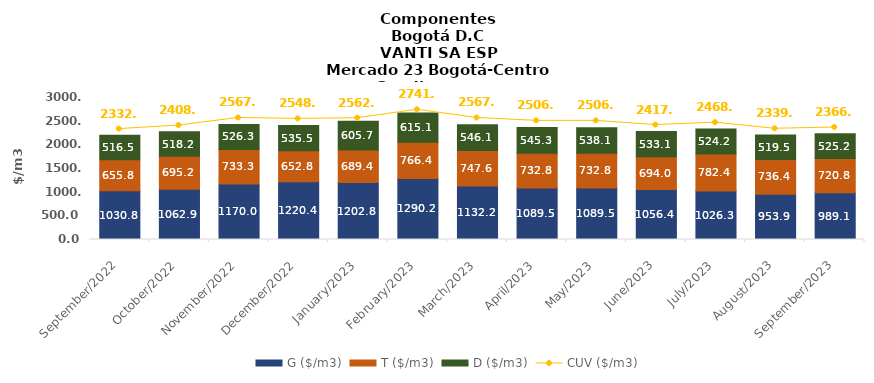
| Category | G ($/m3) | T ($/m3) | D ($/m3) |
|---|---|---|---|
| 2022-09-01 | 1030.83 | 655.81 | 516.52 |
| 2022-10-01 | 1062.85 | 695.15 | 518.18 |
| 2022-11-01 | 1169.95 | 733.29 | 526.27 |
| 2022-12-01 | 1220.44 | 652.77 | 535.5 |
| 2023-01-01 | 1202.77 | 689.37 | 605.73 |
| 2023-02-01 | 1290.19 | 766.35 | 615.06 |
| 2023-03-01 | 1132.24 | 747.55 | 546.05 |
| 2023-04-01 | 1089.52 | 732.84 | 545.26 |
| 2023-05-01 | 1089.52 | 732.84 | 538.11 |
| 2023-06-01 | 1056.38 | 694.03 | 533.13 |
| 2023-07-01 | 1026.28 | 782.44 | 524.19 |
| 2023-08-01 | 953.86 | 736.37 | 519.49 |
| 2023-09-01 | 989.12 | 720.82 | 525.15 |